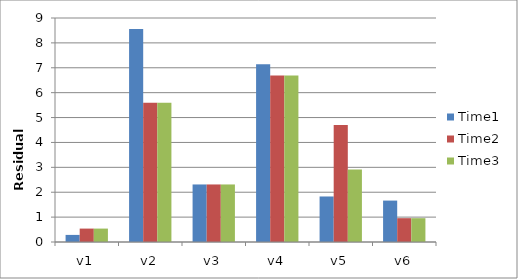
| Category | Time1 | Time2 | Time3 |
|---|---|---|---|
| v1 | 0.285 | 0.539 | 0.539 |
| v2 | 8.562 | 5.592 | 5.592 |
| v3 | 2.312 | 2.312 | 2.312 |
| v4 | 7.139 | 6.686 | 6.686 |
| v5 | 1.829 | 4.705 | 2.908 |
| v6 | 1.664 | 0.957 | 0.957 |